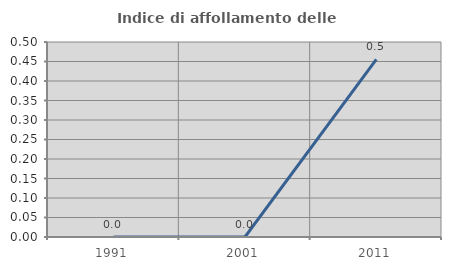
| Category | Indice di affollamento delle abitazioni  |
|---|---|
| 1991.0 | 0 |
| 2001.0 | 0 |
| 2011.0 | 0.456 |